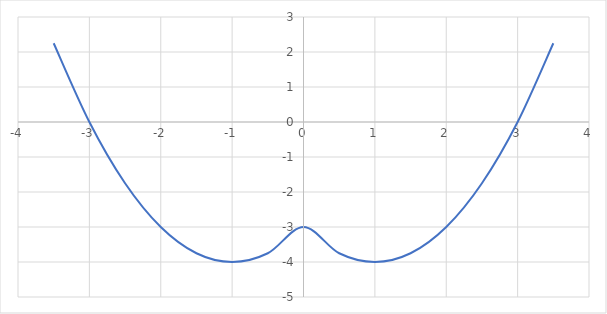
| Category | Series 0 |
|---|---|
| -3.5 | 2.25 |
| -3.0 | 0 |
| -2.5 | -1.75 |
| -2.0 | -3 |
| -1.5 | -3.75 |
| -1.0 | -4 |
| -0.5 | -3.75 |
| 0.0 | -3 |
| 0.5 | -3.75 |
| 1.0 | -4 |
| 1.5 | -3.75 |
| 2.0 | -3 |
| 2.5 | -1.75 |
| 3.0 | 0 |
| 3.5 | 2.25 |